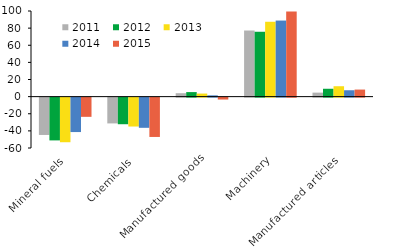
| Category | 2011 | 2012 | 2013 | 2014 | 2015 |
|---|---|---|---|---|---|
| Mineral fuels | -43.599 | -49.965 | -52.094 | -40.215 | -22.439 |
| Chemicals | -30.127 | -31.066 | -33.75 | -35.263 | -45.937 |
| Manufactured goods | 3.994 | 5.295 | 3.578 | 1.486 | -2.241 |
| Machinery | 77.214 | 75.75 | 87.433 | 88.846 | 99.272 |
| Manufactured articles | 4.657 | 9.183 | 12.146 | 7.455 | 8.235 |